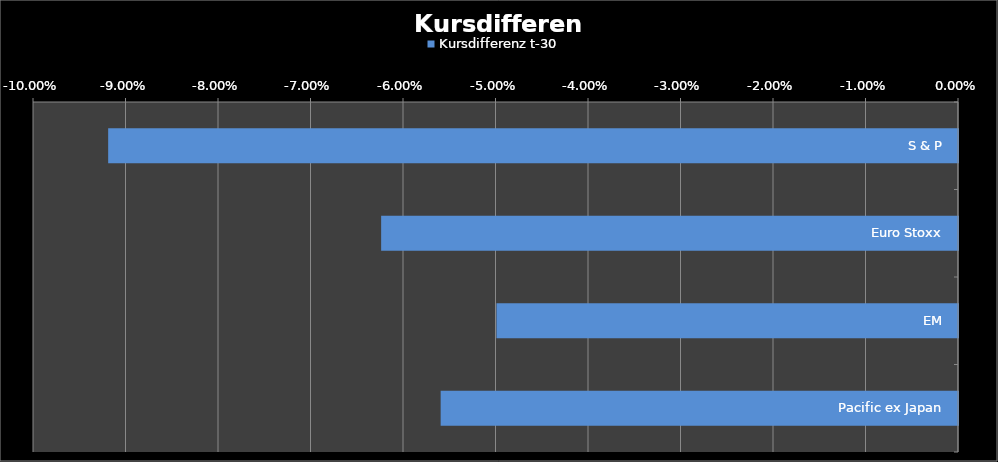
| Category | Kursdifferenz t-30 | #REF! | #BEZUG! |
|---|---|---|---|
| S & P | -0.092 |  |  |
| Euro Stoxx | -0.062 |  |  |
| EM | -0.05 |  |  |
| Pacific ex Japan | -0.056 |  |  |